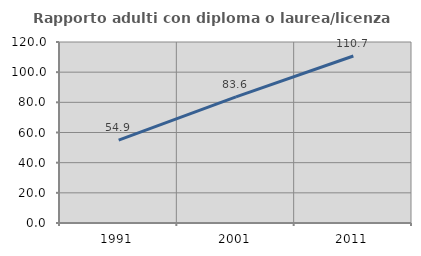
| Category | Rapporto adulti con diploma o laurea/licenza media  |
|---|---|
| 1991.0 | 54.918 |
| 2001.0 | 83.601 |
| 2011.0 | 110.702 |